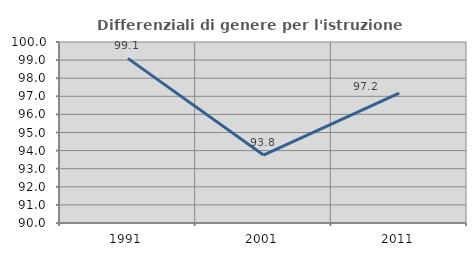
| Category | Differenziali di genere per l'istruzione superiore |
|---|---|
| 1991.0 | 99.097 |
| 2001.0 | 93.756 |
| 2011.0 | 97.174 |